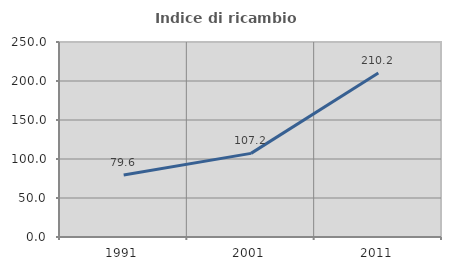
| Category | Indice di ricambio occupazionale  |
|---|---|
| 1991.0 | 79.577 |
| 2001.0 | 107.207 |
| 2011.0 | 210.219 |